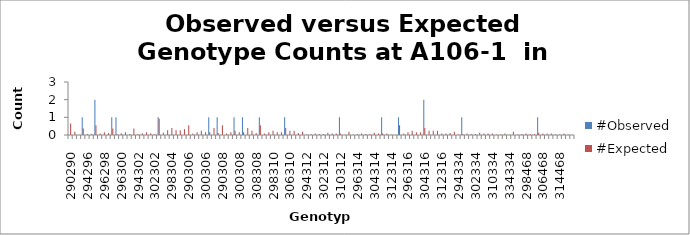
| Category | #Observed | #Expected |
|---|---|---|
| 290290.0 | 0 | 0.645 |
| 290294.0 | 0 | 0.184 |
| 294294.0 | 0 | 0.013 |
| 290296.0 | 1 | 0.368 |
| 294296.0 | 0 | 0.053 |
| 296296.0 | 0 | 0.053 |
| 290298.0 | 2 | 0.553 |
| 294298.0 | 0 | 0.079 |
| 296298.0 | 0 | 0.158 |
| 298298.0 | 0 | 0.118 |
| 290300.0 | 1 | 0.368 |
| 294300.0 | 1 | 0.053 |
| 296300.0 | 0 | 0.105 |
| 298300.0 | 0 | 0.158 |
| 300300.0 | 0 | 0.053 |
| 290302.0 | 0 | 0.368 |
| 294302.0 | 0 | 0.053 |
| 296302.0 | 0 | 0.105 |
| 298302.0 | 0 | 0.158 |
| 300302.0 | 0 | 0.105 |
| 302302.0 | 0 | 0.053 |
| 290304.0 | 1 | 0.921 |
| 294304.0 | 0 | 0.132 |
| 296304.0 | 0 | 0.263 |
| 298304.0 | 0 | 0.395 |
| 300304.0 | 0 | 0.263 |
| 302304.0 | 0 | 0.263 |
| 304304.0 | 0 | 0.329 |
| 290306.0 | 0 | 0.553 |
| 294306.0 | 0 | 0.079 |
| 296306.0 | 0 | 0.158 |
| 298306.0 | 0 | 0.237 |
| 300306.0 | 0 | 0.158 |
| 302306.0 | 1 | 0.158 |
| 304306.0 | 0 | 0.395 |
| 306306.0 | 1 | 0.118 |
| 290308.0 | 0 | 0.553 |
| 294308.0 | 0 | 0.079 |
| 296308.0 | 0 | 0.158 |
| 298308.0 | 1 | 0.237 |
| 300308.0 | 0 | 0.158 |
| 302308.0 | 1 | 0.158 |
| 304308.0 | 0 | 0.395 |
| 306308.0 | 0 | 0.237 |
| 308308.0 | 0 | 0.118 |
| 290310.0 | 1 | 0.553 |
| 294310.0 | 0 | 0.079 |
| 296310.0 | 0 | 0.158 |
| 298310.0 | 0 | 0.237 |
| 300310.0 | 0 | 0.158 |
| 302310.0 | 0 | 0.158 |
| 304310.0 | 1 | 0.395 |
| 306310.0 | 0 | 0.237 |
| 308310.0 | 0 | 0.237 |
| 310310.0 | 0 | 0.118 |
| 290312.0 | 0 | 0.184 |
| 294312.0 | 0 | 0.026 |
| 296312.0 | 0 | 0.053 |
| 298312.0 | 0 | 0.079 |
| 300312.0 | 0 | 0.053 |
| 302312.0 | 0 | 0.053 |
| 304312.0 | 0 | 0.132 |
| 306312.0 | 0 | 0.079 |
| 308312.0 | 0 | 0.079 |
| 310312.0 | 1 | 0.079 |
| 312312.0 | 0 | 0.013 |
| 290314.0 | 0 | 0.184 |
| 294314.0 | 0 | 0.026 |
| 296314.0 | 0 | 0.053 |
| 298314.0 | 0 | 0.079 |
| 300314.0 | 0 | 0.053 |
| 302314.0 | 0 | 0.053 |
| 304314.0 | 0 | 0.132 |
| 306314.0 | 0 | 0.079 |
| 308314.0 | 1 | 0.079 |
| 310314.0 | 0 | 0.079 |
| 312314.0 | 0 | 0.026 |
| 314314.0 | 0 | 0.013 |
| 290316.0 | 1 | 0.553 |
| 294316.0 | 0 | 0.079 |
| 296316.0 | 0 | 0.158 |
| 298316.0 | 0 | 0.237 |
| 300316.0 | 0 | 0.158 |
| 302316.0 | 0 | 0.158 |
| 304316.0 | 2 | 0.395 |
| 306316.0 | 0 | 0.237 |
| 308316.0 | 0 | 0.237 |
| 310316.0 | 0 | 0.237 |
| 312316.0 | 0 | 0.079 |
| 314316.0 | 0 | 0.079 |
| 316316.0 | 0 | 0.118 |
| 290334.0 | 0 | 0.184 |
| 294334.0 | 0 | 0.026 |
| 296334.0 | 1 | 0.053 |
| 298334.0 | 0 | 0.079 |
| 300334.0 | 0 | 0.053 |
| 302334.0 | 0 | 0.053 |
| 304334.0 | 0 | 0.132 |
| 306334.0 | 0 | 0.079 |
| 308334.0 | 0 | 0.079 |
| 310334.0 | 0 | 0.079 |
| 312334.0 | 0 | 0.026 |
| 314334.0 | 0 | 0.026 |
| 316334.0 | 0 | 0.079 |
| 334334.0 | 0 | 0.013 |
| 290468.0 | 0 | 0.184 |
| 294468.0 | 0 | 0.026 |
| 296468.0 | 0 | 0.053 |
| 298468.0 | 0 | 0.079 |
| 300468.0 | 0 | 0.053 |
| 302468.0 | 0 | 0.053 |
| 304468.0 | 1 | 0.132 |
| 306468.0 | 0 | 0.079 |
| 308468.0 | 0 | 0.079 |
| 310468.0 | 0 | 0.079 |
| 312468.0 | 0 | 0.026 |
| 314468.0 | 0 | 0.026 |
| 316468.0 | 0 | 0.079 |
| 334468.0 | 0 | 0.026 |
| 468468.0 | 0 | 0.013 |